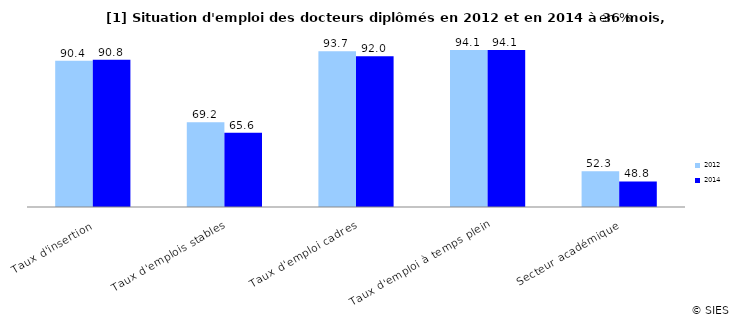
| Category | 2012 | 2014 |
|---|---|---|
| Taux d'insertion | 90.4 | 90.8 |
| Taux d'emplois stables | 69.2 | 65.6 |
| Taux d'emploi cadres | 93.7 | 92 |
| Taux d'emploi à temps plein | 94.1 | 94.1 |
| Secteur académique | 52.3 | 48.8 |